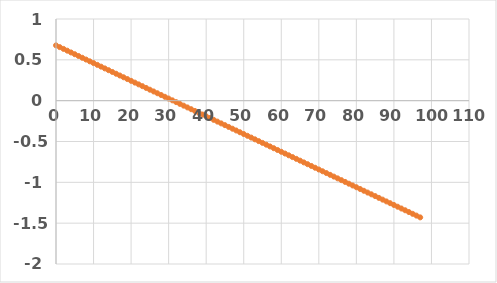
| Category | Series 1 |
|---|---|
| 0.0 | 0.677 |
| 1.0 | 0.656 |
| 2.0 | 0.634 |
| 3.0 | 0.612 |
| 4.0 | 0.59 |
| 5.0 | 0.569 |
| 6.0 | 0.547 |
| 7.0 | 0.525 |
| 8.0 | 0.504 |
| 9.0 | 0.482 |
| 10.0 | 0.46 |
| 11.0 | 0.438 |
| 12.0 | 0.417 |
| 13.0 | 0.395 |
| 14.0 | 0.373 |
| 15.0 | 0.352 |
| 16.0 | 0.33 |
| 17.0 | 0.308 |
| 18.0 | 0.286 |
| 19.0 | 0.265 |
| 20.0 | 0.243 |
| 21.0 | 0.221 |
| 22.0 | 0.2 |
| 23.0 | 0.178 |
| 24.0 | 0.156 |
| 25.0 | 0.134 |
| 26.0 | 0.113 |
| 27.0 | 0.091 |
| 28.0 | 0.069 |
| 29.0 | 0.048 |
| 30.0 | 0.026 |
| 31.0 | 0.004 |
| 32.0 | -0.018 |
| 33.0 | -0.039 |
| 34.0 | -0.061 |
| 35.0 | -0.083 |
| 36.0 | -0.104 |
| 37.0 | -0.126 |
| 38.0 | -0.148 |
| 39.0 | -0.17 |
| 40.0 | -0.191 |
| 41.0 | -0.213 |
| 42.0 | -0.235 |
| 43.0 | -0.256 |
| 44.0 | -0.278 |
| 45.0 | -0.3 |
| 46.0 | -0.322 |
| 47.0 | -0.343 |
| 48.0 | -0.365 |
| 49.0 | -0.387 |
| 50.0 | -0.408 |
| 51.0 | -0.43 |
| 52.0 | -0.452 |
| 53.0 | -0.474 |
| 54.0 | -0.495 |
| 55.0 | -0.517 |
| 56.0 | -0.539 |
| 57.0 | -0.56 |
| 58.0 | -0.582 |
| 59.0 | -0.604 |
| 60.0 | -0.626 |
| 61.0 | -0.647 |
| 62.0 | -0.669 |
| 63.0 | -0.691 |
| 64.0 | -0.712 |
| 65.0 | -0.734 |
| 66.0 | -0.756 |
| 67.0 | -0.778 |
| 68.0 | -0.799 |
| 69.0 | -0.821 |
| 70.0 | -0.843 |
| 71.0 | -0.864 |
| 72.0 | -0.886 |
| 73.0 | -0.908 |
| 74.0 | -0.93 |
| 75.0 | -0.951 |
| 76.0 | -0.973 |
| 77.0 | -0.995 |
| 78.0 | -1.016 |
| 79.0 | -1.038 |
| 80.0 | -1.06 |
| 81.0 | -1.082 |
| 82.0 | -1.103 |
| 83.0 | -1.125 |
| 84.0 | -1.147 |
| 85.0 | -1.168 |
| 86.0 | -1.19 |
| 87.0 | -1.212 |
| 88.0 | -1.234 |
| 89.0 | -1.255 |
| 90.0 | -1.277 |
| 91.0 | -1.299 |
| 92.0 | -1.32 |
| 93.0 | -1.342 |
| 94.0 | -1.364 |
| 95.0 | -1.386 |
| 96.0 | -1.407 |
| 97.0 | -1.429 |